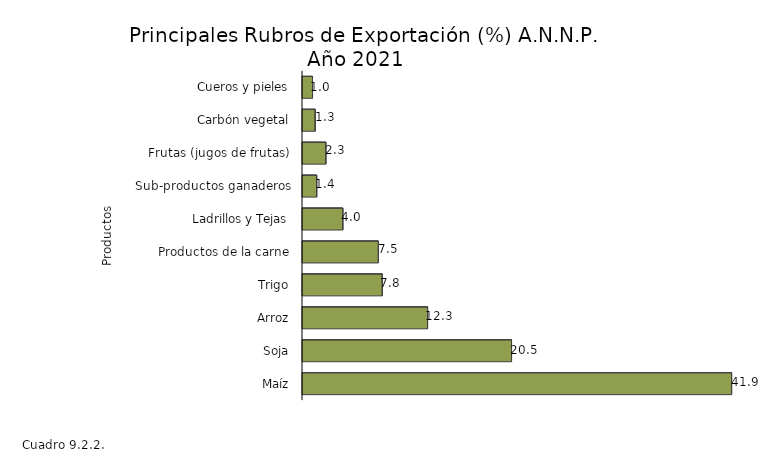
| Category | Series 0 |
|---|---|
| Maíz | 41.935 |
| Soja | 20.454 |
| Arroz | 12.257 |
| Trigo | 7.837 |
| Productos de la carne | 7.456 |
| Ladrillos y Tejas | 3.984 |
| Sub-productos ganaderos | 1.436 |
| Frutas (jugos de frutas) | 2.328 |
| Carbón vegetal | 1.284 |
| Cueros y pieles | 1.028 |